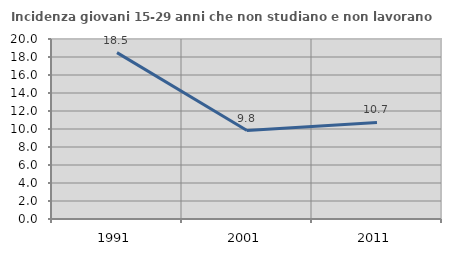
| Category | Incidenza giovani 15-29 anni che non studiano e non lavorano  |
|---|---|
| 1991.0 | 18.49 |
| 2001.0 | 9.827 |
| 2011.0 | 10.733 |